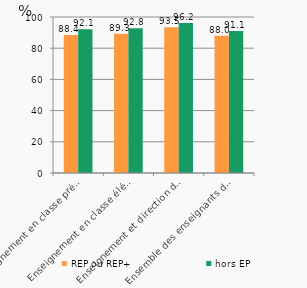
| Category | REP ou REP+ | hors EP |
|---|---|---|
| Enseignement en classe préélémentaire | 88.4 | 92.1 |
| Enseignement en classe élémentaire | 89.3 | 92.8 |
| Enseignement et direction d'école simultanés | 93.5 | 96.2 |
| Ensemble des enseignants du premier degré public | 88 | 91.1 |